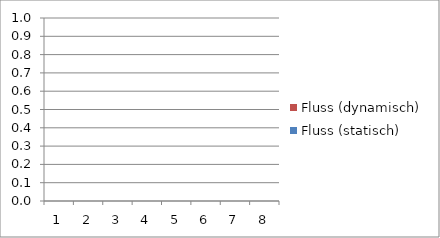
| Category | Fluss (dynamisch) | Fluss (statisch) |
|---|---|---|
| 1.0 | 0 | 0 |
| 2.0 | 0 | 0 |
| 3.0 | 0 | 0 |
| 4.0 | 0 | 0 |
| 5.0 | 0 | 0 |
| 6.0 | 0 | 0 |
| 7.0 | 0 | 0 |
| 8.0 | 0 | 0 |